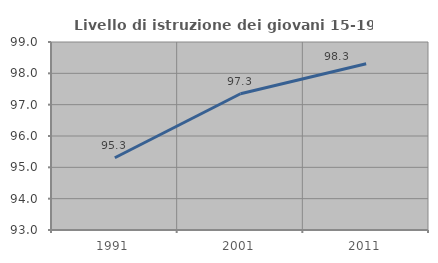
| Category | Livello di istruzione dei giovani 15-19 anni |
|---|---|
| 1991.0 | 95.307 |
| 2001.0 | 97.348 |
| 2011.0 | 98.306 |